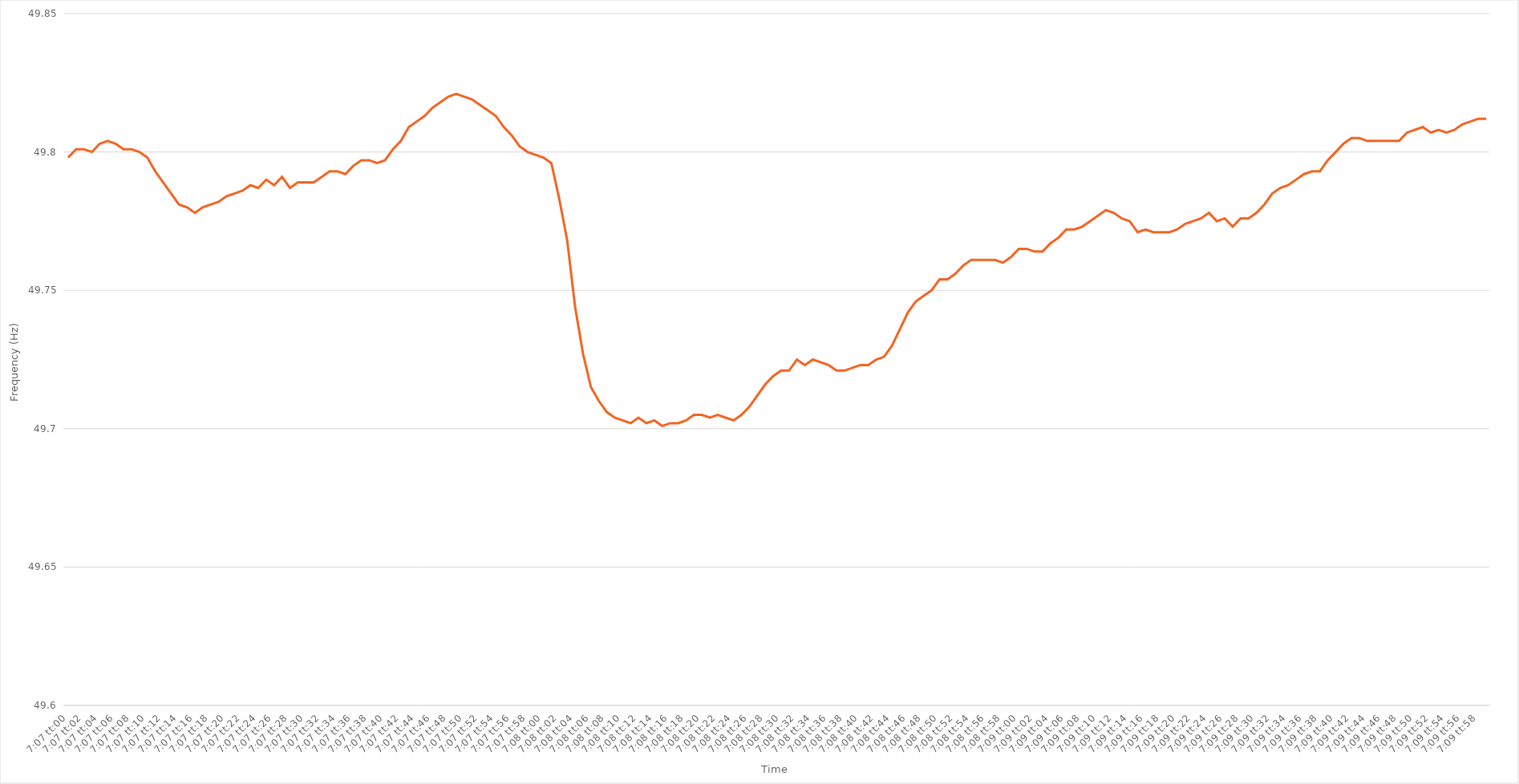
| Category | Series 0 |
|---|---|
| 0.2965277777777778 | 49.798 |
| 0.2965393518518518 | 49.801 |
| 0.2965509259259259 | 49.801 |
| 0.2965625 | 49.8 |
| 0.29657407407407405 | 49.803 |
| 0.29658564814814814 | 49.804 |
| 0.29659722222222223 | 49.803 |
| 0.2966087962962963 | 49.801 |
| 0.29662037037037037 | 49.801 |
| 0.29663194444444446 | 49.8 |
| 0.2966435185185185 | 49.798 |
| 0.2966550925925926 | 49.793 |
| 0.2966666666666667 | 49.789 |
| 0.29667824074074073 | 49.785 |
| 0.2966898148148148 | 49.781 |
| 0.2967013888888889 | 49.78 |
| 0.29671296296296296 | 49.778 |
| 0.29672453703703705 | 49.78 |
| 0.29673611111111114 | 49.781 |
| 0.2967476851851852 | 49.782 |
| 0.2967592592592592 | 49.784 |
| 0.2967708333333333 | 49.785 |
| 0.2967824074074074 | 49.786 |
| 0.29679398148148145 | 49.788 |
| 0.29680555555555554 | 49.787 |
| 0.29681712962962964 | 49.79 |
| 0.2968287037037037 | 49.788 |
| 0.2968402777777778 | 49.791 |
| 0.29685185185185187 | 49.787 |
| 0.2968634259259259 | 49.789 |
| 0.296875 | 49.789 |
| 0.2968865740740741 | 49.789 |
| 0.29689814814814813 | 49.791 |
| 0.2969097222222222 | 49.793 |
| 0.2969212962962963 | 49.793 |
| 0.29693287037037036 | 49.792 |
| 0.29694444444444446 | 49.795 |
| 0.29695601851851855 | 49.797 |
| 0.2969675925925926 | 49.797 |
| 0.2969791666666667 | 49.796 |
| 0.2969907407407408 | 49.797 |
| 0.2970023148148148 | 49.801 |
| 0.29701388888888886 | 49.804 |
| 0.29702546296296295 | 49.809 |
| 0.29703703703703704 | 49.811 |
| 0.2970486111111111 | 49.813 |
| 0.2970601851851852 | 49.816 |
| 0.29707175925925927 | 49.818 |
| 0.2970833333333333 | 49.82 |
| 0.2970949074074074 | 49.821 |
| 0.2971064814814815 | 49.82 |
| 0.29711805555555554 | 49.819 |
| 0.29712962962962963 | 49.817 |
| 0.2971412037037037 | 49.815 |
| 0.29715277777777777 | 49.813 |
| 0.29716435185185186 | 49.809 |
| 0.29717592592592595 | 49.806 |
| 0.2971875 | 49.802 |
| 0.2971990740740741 | 49.8 |
| 0.2972106481481482 | 49.799 |
| 0.2972222222222222 | 49.798 |
| 0.2972337962962963 | 49.796 |
| 0.29724537037037035 | 49.783 |
| 0.29725694444444445 | 49.768 |
| 0.2972685185185185 | 49.744 |
| 0.2972800925925926 | 49.727 |
| 0.2972916666666667 | 49.715 |
| 0.2973032407407407 | 49.71 |
| 0.2973148148148148 | 49.706 |
| 0.2973263888888889 | 49.704 |
| 0.29733796296296294 | 49.703 |
| 0.29734953703703704 | 49.702 |
| 0.29736111111111113 | 49.704 |
| 0.29737268518518517 | 49.702 |
| 0.29738425925925926 | 49.703 |
| 0.29739583333333336 | 49.701 |
| 0.2974074074074074 | 49.702 |
| 0.2974189814814815 | 49.702 |
| 0.2974305555555556 | 49.703 |
| 0.2974421296296296 | 49.705 |
| 0.2974537037037037 | 49.705 |
| 0.29746527777777776 | 49.704 |
| 0.29747685185185185 | 49.705 |
| 0.2974884259259259 | 49.704 |
| 0.2975 | 49.703 |
| 0.2975115740740741 | 49.705 |
| 0.2975231481481481 | 49.708 |
| 0.2975347222222222 | 49.712 |
| 0.2975462962962963 | 49.716 |
| 0.29755787037037035 | 49.719 |
| 0.29756944444444444 | 49.721 |
| 0.29758101851851854 | 49.721 |
| 0.2975925925925926 | 49.725 |
| 0.29760416666666667 | 49.723 |
| 0.29761574074074076 | 49.725 |
| 0.2976273148148148 | 49.724 |
| 0.2976388888888889 | 49.723 |
| 0.297650462962963 | 49.721 |
| 0.29766203703703703 | 49.721 |
| 0.2976736111111111 | 49.722 |
| 0.2976851851851852 | 49.723 |
| 0.29769675925925926 | 49.723 |
| 0.2977083333333333 | 49.725 |
| 0.2977199074074074 | 49.726 |
| 0.2977314814814815 | 49.73 |
| 0.2977430555555555 | 49.736 |
| 0.2977546296296296 | 49.742 |
| 0.2977662037037037 | 49.746 |
| 0.29777777777777775 | 49.748 |
| 0.29778935185185185 | 49.75 |
| 0.29780092592592594 | 49.754 |
| 0.2978125 | 49.754 |
| 0.2978240740740741 | 49.756 |
| 0.29783564814814817 | 49.759 |
| 0.2978472222222222 | 49.761 |
| 0.2978587962962963 | 49.761 |
| 0.2978703703703704 | 49.761 |
| 0.29788194444444444 | 49.761 |
| 0.29789351851851853 | 49.76 |
| 0.2979050925925926 | 49.762 |
| 0.29791666666666666 | 49.765 |
| 0.29792824074074076 | 49.765 |
| 0.29793981481481485 | 49.764 |
| 0.2979513888888889 | 49.764 |
| 0.29796296296296293 | 49.767 |
| 0.297974537037037 | 49.769 |
| 0.2979861111111111 | 49.772 |
| 0.29799768518518516 | 49.772 |
| 0.29800925925925925 | 49.773 |
| 0.29802083333333335 | 49.775 |
| 0.2980324074074074 | 49.777 |
| 0.2980439814814815 | 49.779 |
| 0.2980555555555556 | 49.778 |
| 0.2980671296296296 | 49.776 |
| 0.2980787037037037 | 49.775 |
| 0.2980902777777778 | 49.771 |
| 0.29810185185185184 | 49.772 |
| 0.29811342592592593 | 49.771 |
| 0.29812500000000003 | 49.771 |
| 0.29813657407407407 | 49.771 |
| 0.29814814814814816 | 49.772 |
| 0.29815972222222226 | 49.774 |
| 0.2981712962962963 | 49.775 |
| 0.29818287037037033 | 49.776 |
| 0.29819444444444443 | 49.778 |
| 0.2982060185185185 | 49.775 |
| 0.29821759259259256 | 49.776 |
| 0.29822916666666666 | 49.773 |
| 0.29824074074074075 | 49.776 |
| 0.2982523148148148 | 49.776 |
| 0.2982638888888889 | 49.778 |
| 0.298275462962963 | 49.781 |
| 0.298287037037037 | 49.785 |
| 0.2982986111111111 | 49.787 |
| 0.2983101851851852 | 49.788 |
| 0.29832175925925924 | 49.79 |
| 0.29833333333333334 | 49.792 |
| 0.29834490740740743 | 49.793 |
| 0.2983564814814815 | 49.793 |
| 0.29836805555555557 | 49.797 |
| 0.29837962962962966 | 49.8 |
| 0.2983912037037037 | 49.803 |
| 0.2984027777777778 | 49.805 |
| 0.29841435185185183 | 49.805 |
| 0.29842592592592593 | 49.804 |
| 0.29843749999999997 | 49.804 |
| 0.29844907407407406 | 49.804 |
| 0.29846064814814816 | 49.804 |
| 0.2984722222222222 | 49.804 |
| 0.2984837962962963 | 49.807 |
| 0.2984953703703704 | 49.808 |
| 0.2985069444444444 | 49.809 |
| 0.2985185185185185 | 49.807 |
| 0.2985300925925926 | 49.808 |
| 0.29854166666666665 | 49.807 |
| 0.29855324074074074 | 49.808 |
| 0.29856481481481484 | 49.81 |
| 0.2985763888888889 | 49.811 |
| 0.29858796296296297 | 49.812 |
| 0.29859953703703707 | 49.812 |